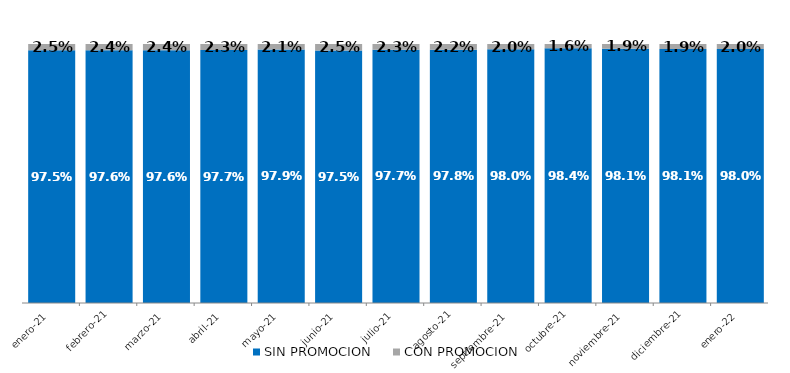
| Category | SIN PROMOCION   | CON PROMOCION   |
|---|---|---|
| 2021-01-01 | 0.975 | 0.025 |
| 2021-02-01 | 0.976 | 0.024 |
| 2021-03-01 | 0.976 | 0.024 |
| 2021-04-01 | 0.977 | 0.023 |
| 2021-05-01 | 0.979 | 0.021 |
| 2021-06-01 | 0.975 | 0.025 |
| 2021-07-01 | 0.977 | 0.023 |
| 2021-08-01 | 0.978 | 0.022 |
| 2021-09-01 | 0.98 | 0.02 |
| 2021-10-01 | 0.984 | 0.016 |
| 2021-11-01 | 0.981 | 0.019 |
| 2021-12-01 | 0.981 | 0.019 |
| 2022-01-01 | 0.98 | 0.02 |